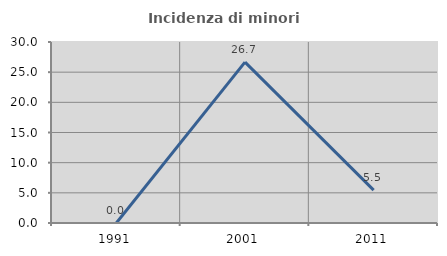
| Category | Incidenza di minori stranieri |
|---|---|
| 1991.0 | 0 |
| 2001.0 | 26.667 |
| 2011.0 | 5.455 |